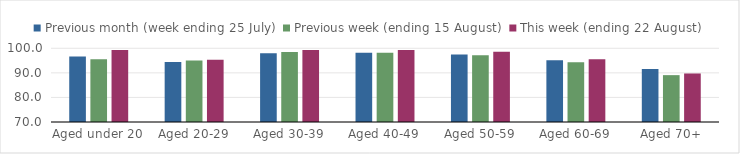
| Category | Previous month (week ending 25 July) | Previous week (ending 15 August) | This week (ending 22 August) |
|---|---|---|---|
| Aged under 20 | 96.705 | 95.556 | 99.258 |
| Aged 20-29 | 94.423 | 95 | 95.349 |
| Aged 30-39 | 98.017 | 98.494 | 99.323 |
| Aged 40-49 | 98.139 | 98.157 | 99.263 |
| Aged 50-59 | 97.516 | 97.191 | 98.551 |
| Aged 60-69 | 95.1 | 94.274 | 95.495 |
| Aged 70+ | 91.608 | 89.071 | 89.749 |